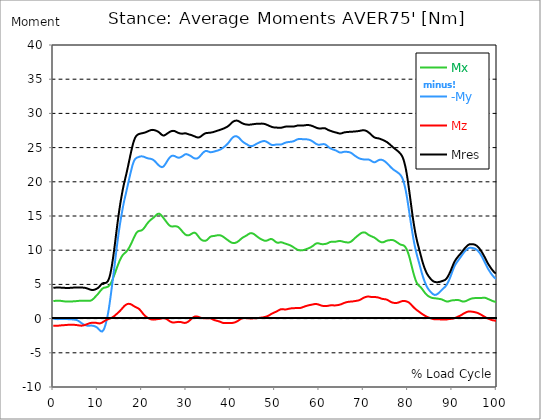
| Category |  Mx |  -My |  Mz |  Mres |
|---|---|---|---|---|
| 0.0 | 2.563 | -0.024 | -1.043 | 4.505 |
| 0.167348456675344 | 2.571 | -0.032 | -1.043 | 4.513 |
| 0.334696913350688 | 2.587 | -0.04 | -1.043 | 4.521 |
| 0.5020453700260321 | 2.602 | -0.056 | -1.051 | 4.528 |
| 0.669393826701376 | 2.61 | -0.064 | -1.051 | 4.536 |
| 0.83674228337672 | 2.618 | -0.08 | -1.051 | 4.544 |
| 1.0040907400520642 | 2.626 | -0.08 | -1.043 | 4.544 |
| 1.1621420602454444 | 2.626 | -0.08 | -1.035 | 4.544 |
| 1.3294905169207885 | 2.618 | -0.072 | -1.019 | 4.544 |
| 1.4968389735961325 | 2.61 | -0.072 | -1.011 | 4.536 |
| 1.6641874302714765 | 2.595 | -0.064 | -0.995 | 4.528 |
| 1.8315358869468206 | 2.579 | -0.064 | -0.987 | 4.528 |
| 1.9988843436221646 | 2.563 | -0.064 | -0.979 | 4.521 |
| 2.1662328002975086 | 2.547 | -0.064 | -0.971 | 4.513 |
| 2.333581256972853 | 2.531 | -0.064 | -0.963 | 4.505 |
| 2.5009297136481967 | 2.515 | -0.064 | -0.955 | 4.497 |
| 2.6682781703235405 | 2.507 | -0.064 | -0.947 | 4.489 |
| 2.8356266269988843 | 2.491 | -0.072 | -0.939 | 4.481 |
| 3.002975083674229 | 2.491 | -0.072 | -0.931 | 4.481 |
| 3.1703235403495724 | 2.483 | -0.072 | -0.915 | 4.473 |
| 3.337671997024917 | 2.483 | -0.08 | -0.907 | 4.481 |
| 3.4957233172182973 | 2.475 | -0.08 | -0.899 | 4.481 |
| 3.663071773893641 | 2.483 | -0.088 | -0.899 | 4.489 |
| 3.8304202305689854 | 2.483 | -0.096 | -0.899 | 4.497 |
| 3.997768687244329 | 2.491 | -0.103 | -0.899 | 4.505 |
| 4.165117143919673 | 2.507 | -0.111 | -0.899 | 4.513 |
| 4.332465600595017 | 2.515 | -0.119 | -0.899 | 4.521 |
| 4.499814057270361 | 2.523 | -0.127 | -0.907 | 4.528 |
| 4.667162513945706 | 2.531 | -0.143 | -0.907 | 4.536 |
| 4.834510970621049 | 2.539 | -0.151 | -0.915 | 4.536 |
| 5.001859427296393 | 2.547 | -0.175 | -0.931 | 4.536 |
| 5.169207883971737 | 2.555 | -0.199 | -0.939 | 4.536 |
| 5.336556340647081 | 2.563 | -0.231 | -0.955 | 4.528 |
| 5.503904797322425 | 2.571 | -0.279 | -0.971 | 4.536 |
| 5.671253253997769 | 2.587 | -0.342 | -0.987 | 4.536 |
| 5.82930457419115 | 2.595 | -0.414 | -1.003 | 4.536 |
| 5.996653030866494 | 2.61 | -0.493 | -1.019 | 4.536 |
| 6.164001487541838 | 2.618 | -0.573 | -1.035 | 4.536 |
| 6.331349944217181 | 2.618 | -0.653 | -1.035 | 4.536 |
| 6.498698400892526 | 2.618 | -0.724 | -1.027 | 4.536 |
| 6.66604685756787 | 2.618 | -0.796 | -1.011 | 4.528 |
| 6.833395314243213 | 2.618 | -0.852 | -0.987 | 4.521 |
| 7.000743770918558 | 2.61 | -0.907 | -0.955 | 4.513 |
| 7.168092227593902 | 2.602 | -0.947 | -0.915 | 4.489 |
| 7.335440684269246 | 2.602 | -0.979 | -0.883 | 4.465 |
| 7.50278914094459 | 2.595 | -1.011 | -0.844 | 4.433 |
| 7.6701375976199335 | 2.595 | -1.035 | -0.796 | 4.401 |
| 7.837486054295278 | 2.595 | -1.043 | -0.756 | 4.361 |
| 7.995537374488658 | 2.595 | -1.043 | -0.716 | 4.322 |
| 8.162885831164003 | 2.595 | -1.035 | -0.676 | 4.274 |
| 8.330234287839346 | 2.618 | -1.027 | -0.645 | 4.234 |
| 8.49758274451469 | 2.65 | -1.027 | -0.629 | 4.21 |
| 8.664931201190035 | 2.706 | -1.027 | -0.613 | 4.186 |
| 8.832279657865378 | 2.786 | -1.043 | -0.605 | 4.178 |
| 8.999628114540721 | 2.873 | -1.059 | -0.597 | 4.186 |
| 9.166976571216066 | 2.985 | -1.09 | -0.597 | 4.202 |
| 9.334325027891412 | 3.096 | -1.122 | -0.597 | 4.242 |
| 9.501673484566755 | 3.207 | -1.162 | -0.605 | 4.282 |
| 9.669021941242098 | 3.327 | -1.218 | -0.621 | 4.33 |
| 9.836370397917442 | 3.438 | -1.289 | -0.645 | 4.385 |
| 10.003718854592787 | 3.558 | -1.385 | -0.669 | 4.449 |
| 10.17106731126813 | 3.685 | -1.496 | -0.692 | 4.536 |
| 10.329118631461512 | 3.82 | -1.624 | -0.708 | 4.648 |
| 10.496467088136853 | 3.955 | -1.743 | -0.7 | 4.767 |
| 10.663815544812199 | 4.091 | -1.831 | -0.676 | 4.895 |
| 10.831164001487544 | 4.226 | -1.886 | -0.629 | 5.014 |
| 10.998512458162887 | 4.345 | -1.886 | -0.573 | 5.117 |
| 11.16586091483823 | 4.441 | -1.815 | -0.501 | 5.189 |
| 11.333209371513574 | 4.497 | -1.655 | -0.438 | 5.213 |
| 11.50055782818892 | 4.528 | -1.401 | -0.366 | 5.205 |
| 11.667906284864264 | 4.544 | -1.09 | -0.302 | 5.197 |
| 11.835254741539607 | 4.56 | -0.716 | -0.247 | 5.213 |
| 12.00260319821495 | 4.584 | -0.279 | -0.183 | 5.269 |
| 12.169951654890292 | 4.624 | 0.207 | -0.135 | 5.372 |
| 12.337300111565641 | 4.68 | 0.756 | -0.088 | 5.523 |
| 12.504648568240984 | 4.767 | 1.385 | -0.048 | 5.762 |
| 12.662699888434362 | 4.871 | 2.093 | 0 | 6.08 |
| 12.830048345109708 | 5.014 | 2.865 | 0.04 | 6.494 |
| 12.997396801785053 | 5.197 | 3.669 | 0.08 | 7.004 |
| 13.164745258460396 | 5.42 | 4.497 | 0.127 | 7.609 |
| 13.33209371513574 | 5.683 | 5.316 | 0.183 | 8.293 |
| 13.499442171811083 | 5.953 | 6.152 | 0.247 | 9.025 |
| 13.666790628486426 | 6.24 | 7.012 | 0.326 | 9.813 |
| 13.834139085161771 | 6.526 | 7.895 | 0.422 | 10.649 |
| 14.001487541837117 | 6.829 | 8.802 | 0.517 | 11.516 |
| 14.16883599851246 | 7.131 | 9.702 | 0.613 | 12.4 |
| 14.336184455187803 | 7.433 | 10.577 | 0.708 | 13.267 |
| 14.503532911863147 | 7.72 | 11.421 | 0.804 | 14.103 |
| 14.670881368538492 | 8.006 | 12.225 | 0.899 | 14.907 |
| 14.828932688731873 | 8.277 | 12.981 | 1.003 | 15.671 |
| 14.996281145407215 | 8.524 | 13.697 | 1.106 | 16.395 |
| 15.163629602082558 | 8.755 | 14.373 | 1.218 | 17.071 |
| 15.330978058757903 | 8.961 | 15.002 | 1.337 | 17.7 |
| 15.498326515433247 | 9.145 | 15.615 | 1.464 | 18.305 |
| 15.665674972108594 | 9.296 | 16.22 | 1.592 | 18.878 |
| 15.833023428783937 | 9.423 | 16.777 | 1.711 | 19.419 |
| 16.00037188545928 | 9.519 | 17.286 | 1.831 | 19.897 |
| 16.167720342134626 | 9.614 | 17.756 | 1.926 | 20.342 |
| 16.335068798809967 | 9.71 | 18.217 | 2.014 | 20.796 |
| 16.502417255485312 | 9.813 | 18.687 | 2.077 | 21.258 |
| 16.669765712160658 | 9.948 | 19.157 | 2.125 | 21.735 |
| 16.837114168836 | 10.1 | 19.642 | 2.157 | 22.237 |
| 17.004462625511344 | 10.267 | 20.128 | 2.165 | 22.746 |
| 17.16251394570472 | 10.458 | 20.613 | 2.157 | 23.255 |
| 17.32986240238007 | 10.665 | 21.083 | 2.133 | 23.765 |
| 17.497210859055414 | 10.88 | 21.536 | 2.093 | 24.266 |
| 17.664559315730756 | 11.11 | 21.974 | 2.037 | 24.752 |
| 17.8319077724061 | 11.349 | 22.372 | 1.966 | 25.205 |
| 17.999256229081443 | 11.588 | 22.714 | 1.894 | 25.619 |
| 18.166604685756788 | 11.827 | 22.993 | 1.823 | 25.977 |
| 18.333953142432133 | 12.057 | 23.216 | 1.759 | 26.272 |
| 18.501301599107478 | 12.272 | 23.367 | 1.703 | 26.502 |
| 18.668650055782823 | 12.455 | 23.462 | 1.655 | 26.67 |
| 18.835998512458165 | 12.607 | 23.526 | 1.608 | 26.797 |
| 19.00334696913351 | 12.718 | 23.574 | 1.552 | 26.884 |
| 19.170695425808855 | 12.79 | 23.605 | 1.496 | 26.948 |
| 19.338043882484197 | 12.821 | 23.645 | 1.417 | 26.988 |
| 19.496095202677576 | 12.837 | 23.685 | 1.305 | 27.028 |
| 19.66344365935292 | 12.853 | 23.709 | 1.186 | 27.052 |
| 19.830792116028263 | 12.877 | 23.725 | 1.043 | 27.075 |
| 19.998140572703612 | 12.941 | 23.725 | 0.907 | 27.099 |
| 20.165489029378953 | 13.02 | 23.709 | 0.764 | 27.123 |
| 20.3328374860543 | 13.132 | 23.677 | 0.637 | 27.147 |
| 20.500185942729644 | 13.267 | 23.637 | 0.517 | 27.171 |
| 20.667534399404985 | 13.418 | 23.59 | 0.406 | 27.203 |
| 20.83488285608033 | 13.578 | 23.542 | 0.31 | 27.251 |
| 21.002231312755672 | 13.737 | 23.494 | 0.231 | 27.29 |
| 21.16957976943102 | 13.888 | 23.462 | 0.159 | 27.338 |
| 21.336928226106362 | 14.023 | 23.43 | 0.088 | 27.386 |
| 21.504276682781704 | 14.151 | 23.407 | 0.032 | 27.434 |
| 21.67162513945705 | 14.262 | 23.391 | -0.016 | 27.481 |
| 21.82967645965043 | 14.365 | 23.375 | -0.064 | 27.521 |
| 21.997024916325774 | 14.461 | 23.351 | -0.096 | 27.553 |
| 22.16437337300112 | 14.548 | 23.319 | -0.127 | 27.577 |
| 22.33172182967646 | 14.636 | 23.279 | -0.143 | 27.593 |
| 22.499070286351806 | 14.716 | 23.223 | -0.151 | 27.585 |
| 22.666418743027148 | 14.803 | 23.144 | -0.151 | 27.569 |
| 22.833767199702496 | 14.899 | 23.048 | -0.143 | 27.545 |
| 23.00111565637784 | 15.002 | 22.945 | -0.127 | 27.513 |
| 23.168464113053183 | 15.114 | 22.826 | -0.111 | 27.473 |
| 23.335812569728528 | 15.217 | 22.706 | -0.088 | 27.434 |
| 23.50316102640387 | 15.305 | 22.579 | -0.072 | 27.378 |
| 23.670509483079215 | 15.344 | 22.467 | -0.064 | 27.314 |
| 23.83785793975456 | 15.344 | 22.372 | -0.048 | 27.235 |
| 23.995909259947936 | 15.305 | 22.284 | -0.04 | 27.147 |
| 24.163257716623285 | 15.225 | 22.221 | -0.016 | 27.052 |
| 24.330606173298627 | 15.106 | 22.165 | 0 | 26.94 |
| 24.49795462997397 | 14.986 | 22.141 | 0.024 | 26.853 |
| 24.665303086649313 | 14.851 | 22.165 | 0.048 | 26.789 |
| 24.83265154332466 | 14.716 | 22.229 | 0.064 | 26.765 |
| 25.0 | 14.572 | 22.34 | 0.056 | 26.781 |
| 25.167348456675345 | 14.429 | 22.491 | 0.04 | 26.829 |
| 25.334696913350694 | 14.286 | 22.658 | 0.008 | 26.892 |
| 25.502045370026035 | 14.143 | 22.834 | -0.048 | 26.972 |
| 25.669393826701377 | 13.999 | 23.017 | -0.111 | 27.044 |
| 25.836742283376722 | 13.864 | 23.192 | -0.191 | 27.123 |
| 26.004090740052067 | 13.737 | 23.351 | -0.271 | 27.195 |
| 26.17143919672741 | 13.625 | 23.494 | -0.35 | 27.259 |
| 26.329490516920792 | 13.546 | 23.613 | -0.422 | 27.322 |
| 26.49683897359613 | 13.498 | 23.717 | -0.485 | 27.378 |
| 26.66418743027148 | 13.474 | 23.781 | -0.525 | 27.418 |
| 26.831535886946828 | 13.466 | 23.812 | -0.557 | 27.442 |
| 26.998884343622166 | 13.474 | 23.82 | -0.573 | 27.45 |
| 27.166232800297514 | 13.49 | 23.797 | -0.573 | 27.442 |
| 27.333581256972852 | 13.506 | 23.765 | -0.557 | 27.418 |
| 27.5009297136482 | 13.506 | 23.709 | -0.541 | 27.37 |
| 27.668278170323543 | 13.498 | 23.653 | -0.525 | 27.322 |
| 27.835626626998888 | 13.474 | 23.605 | -0.509 | 27.259 |
| 28.002975083674233 | 13.442 | 23.558 | -0.493 | 27.203 |
| 28.170323540349575 | 13.387 | 23.526 | -0.485 | 27.155 |
| 28.33767199702492 | 13.299 | 23.518 | -0.478 | 27.115 |
| 28.50502045370026 | 13.196 | 23.542 | -0.485 | 27.083 |
| 28.663071773893645 | 13.076 | 23.582 | -0.493 | 27.06 |
| 28.830420230568986 | 12.949 | 23.629 | -0.517 | 27.044 |
| 28.99776868724433 | 12.814 | 23.693 | -0.541 | 27.036 |
| 29.165117143919673 | 12.686 | 23.765 | -0.573 | 27.036 |
| 29.33246560059502 | 12.559 | 23.836 | -0.605 | 27.052 |
| 29.499814057270367 | 12.447 | 23.924 | -0.629 | 27.075 |
| 29.66716251394571 | 12.344 | 24.003 | -0.637 | 27.091 |
| 29.834510970621054 | 12.264 | 24.043 | -0.621 | 27.091 |
| 30.00185942729639 | 12.201 | 24.051 | -0.589 | 27.068 |
| 30.169207883971744 | 12.169 | 24.027 | -0.549 | 27.028 |
| 30.33655634064708 | 12.153 | 23.98 | -0.485 | 26.98 |
| 30.50390479732243 | 12.169 | 23.932 | -0.414 | 26.94 |
| 30.671253253997772 | 12.209 | 23.876 | -0.318 | 26.908 |
| 30.829304574191156 | 12.264 | 23.828 | -0.223 | 26.884 |
| 30.996653030866494 | 12.328 | 23.765 | -0.119 | 26.861 |
| 31.164001487541842 | 12.392 | 23.693 | -0.016 | 26.829 |
| 31.331349944217187 | 12.455 | 23.613 | 0.08 | 26.781 |
| 31.498698400892525 | 12.519 | 23.542 | 0.159 | 26.741 |
| 31.666046857567874 | 12.559 | 23.47 | 0.231 | 26.693 |
| 31.833395314243212 | 12.567 | 23.422 | 0.287 | 26.654 |
| 32.00074377091856 | 12.535 | 23.391 | 0.31 | 26.606 |
| 32.1680922275939 | 12.455 | 23.375 | 0.326 | 26.558 |
| 32.33544068426925 | 12.336 | 23.391 | 0.318 | 26.51 |
| 32.50278914094459 | 12.201 | 23.43 | 0.302 | 26.487 |
| 32.670137597619934 | 12.049 | 23.494 | 0.263 | 26.479 |
| 32.83748605429528 | 11.906 | 23.582 | 0.223 | 26.487 |
| 33.004834510970625 | 11.771 | 23.685 | 0.175 | 26.518 |
| 33.162885831164004 | 11.652 | 23.812 | 0.135 | 26.582 |
| 33.33023428783935 | 11.556 | 23.94 | 0.103 | 26.662 |
| 33.497582744514695 | 11.484 | 24.067 | 0.088 | 26.749 |
| 33.664931201190036 | 11.429 | 24.179 | 0.072 | 26.837 |
| 33.83227965786538 | 11.397 | 24.29 | 0.056 | 26.916 |
| 33.99962811454073 | 11.365 | 24.385 | 0.048 | 26.988 |
| 34.16697657121607 | 11.365 | 24.457 | 0.048 | 27.052 |
| 34.33432502789141 | 11.381 | 24.505 | 0.04 | 27.099 |
| 34.50167348456676 | 11.421 | 24.513 | 0.04 | 27.123 |
| 34.6690219412421 | 11.492 | 24.497 | 0.048 | 27.139 |
| 34.83637039791744 | 11.596 | 24.457 | 0.064 | 27.139 |
| 35.00371885459279 | 11.707 | 24.417 | 0.072 | 27.155 |
| 35.17106731126814 | 11.827 | 24.37 | 0.072 | 27.163 |
| 35.338415767943474 | 11.93 | 24.338 | 0.048 | 27.171 |
| 35.49646708813686 | 11.994 | 24.33 | 0.016 | 27.195 |
| 35.6638155448122 | 12.034 | 24.338 | -0.024 | 27.219 |
| 35.831164001487544 | 12.057 | 24.354 | -0.072 | 27.235 |
| 35.998512458162885 | 12.065 | 24.377 | -0.127 | 27.259 |
| 36.165860914838234 | 12.073 | 24.401 | -0.175 | 27.29 |
| 36.333209371513576 | 12.089 | 24.433 | -0.223 | 27.322 |
| 36.50055782818892 | 12.113 | 24.473 | -0.255 | 27.362 |
| 36.667906284864266 | 12.137 | 24.505 | -0.287 | 27.402 |
| 36.83525474153961 | 12.161 | 24.529 | -0.31 | 27.434 |
| 37.002603198214956 | 12.177 | 24.561 | -0.334 | 27.465 |
| 37.1699516548903 | 12.193 | 24.6 | -0.366 | 27.505 |
| 37.337300111565646 | 12.193 | 24.632 | -0.398 | 27.537 |
| 37.50464856824098 | 12.185 | 24.68 | -0.43 | 27.569 |
| 37.66269988843437 | 12.169 | 24.728 | -0.47 | 27.609 |
| 37.83004834510971 | 12.137 | 24.783 | -0.517 | 27.649 |
| 37.99739680178505 | 12.089 | 24.847 | -0.573 | 27.688 |
| 38.16474525846039 | 12.026 | 24.927 | -0.613 | 27.728 |
| 38.33209371513574 | 11.962 | 24.998 | -0.637 | 27.768 |
| 38.49944217181109 | 11.882 | 25.086 | -0.661 | 27.816 |
| 38.666790628486424 | 11.803 | 25.173 | -0.661 | 27.863 |
| 38.83413908516178 | 11.723 | 25.269 | -0.661 | 27.911 |
| 39.001487541837115 | 11.636 | 25.364 | -0.653 | 27.967 |
| 39.16883599851246 | 11.564 | 25.46 | -0.645 | 28.023 |
| 39.336184455187805 | 11.484 | 25.571 | -0.645 | 28.094 |
| 39.503532911863154 | 11.405 | 25.691 | -0.645 | 28.174 |
| 39.670881368538495 | 11.317 | 25.834 | -0.645 | 28.269 |
| 39.83822982521384 | 11.238 | 25.985 | -0.653 | 28.381 |
| 39.996281145407224 | 11.174 | 26.136 | -0.645 | 28.484 |
| 40.163629602082565 | 11.118 | 26.28 | -0.645 | 28.596 |
| 40.33097805875791 | 11.079 | 26.399 | -0.637 | 28.691 |
| 40.498326515433256 | 11.055 | 26.502 | -0.621 | 28.771 |
| 40.6656749721086 | 11.047 | 26.574 | -0.597 | 28.842 |
| 40.83302342878393 | 11.047 | 26.638 | -0.573 | 28.89 |
| 41.00037188545929 | 11.071 | 26.67 | -0.541 | 28.93 |
| 41.16772034213463 | 11.102 | 26.686 | -0.493 | 28.954 |
| 41.33506879880997 | 11.15 | 26.662 | -0.446 | 28.954 |
| 41.50241725548531 | 11.214 | 26.622 | -0.382 | 28.938 |
| 41.66976571216066 | 11.277 | 26.55 | -0.318 | 28.906 |
| 41.837114168836 | 11.365 | 26.463 | -0.247 | 28.858 |
| 42.004462625511344 | 11.453 | 26.351 | -0.167 | 28.795 |
| 42.17181108218669 | 11.556 | 26.232 | -0.096 | 28.731 |
| 42.32986240238007 | 11.652 | 26.112 | -0.024 | 28.659 |
| 42.497210859055414 | 11.747 | 26.001 | 0.032 | 28.596 |
| 42.66455931573076 | 11.819 | 25.898 | 0.064 | 28.54 |
| 42.831907772406105 | 11.882 | 25.81 | 0.08 | 28.492 |
| 42.999256229081446 | 11.946 | 25.73 | 0.08 | 28.452 |
| 43.16660468575679 | 12.01 | 25.659 | 0.08 | 28.421 |
| 43.33395314243214 | 12.065 | 25.595 | 0.072 | 28.397 |
| 43.50130159910748 | 12.121 | 25.539 | 0.064 | 28.381 |
| 43.66865005578282 | 12.185 | 25.476 | 0.056 | 28.365 |
| 43.83599851245817 | 12.264 | 25.404 | 0.048 | 28.357 |
| 44.00334696913351 | 12.344 | 25.333 | 0.04 | 28.349 |
| 44.17069542580886 | 12.416 | 25.269 | 0.04 | 28.349 |
| 44.3380438824842 | 12.463 | 25.237 | 0.032 | 28.357 |
| 44.49609520267758 | 12.487 | 25.213 | 0.032 | 28.365 |
| 44.66344365935292 | 12.495 | 25.213 | 0.032 | 28.381 |
| 44.83079211602827 | 12.479 | 25.229 | 0.032 | 28.397 |
| 44.99814057270361 | 12.439 | 25.253 | 0.032 | 28.413 |
| 45.16548902937895 | 12.384 | 25.301 | 0.04 | 28.428 |
| 45.332837486054295 | 12.32 | 25.356 | 0.048 | 28.444 |
| 45.500185942729644 | 12.24 | 25.412 | 0.056 | 28.46 |
| 45.66753439940499 | 12.153 | 25.484 | 0.056 | 28.468 |
| 45.83488285608033 | 12.065 | 25.547 | 0.064 | 28.484 |
| 46.00223131275568 | 11.978 | 25.611 | 0.072 | 28.484 |
| 46.16957976943102 | 11.898 | 25.667 | 0.08 | 28.492 |
| 46.336928226106366 | 11.819 | 25.715 | 0.096 | 28.492 |
| 46.50427668278171 | 11.747 | 25.762 | 0.111 | 28.492 |
| 46.671625139457056 | 11.683 | 25.81 | 0.119 | 28.492 |
| 46.829676459650436 | 11.62 | 25.85 | 0.135 | 28.5 |
| 46.99702491632577 | 11.564 | 25.89 | 0.151 | 28.508 |
| 47.16437337300112 | 11.516 | 25.921 | 0.167 | 28.508 |
| 47.33172182967646 | 11.468 | 25.945 | 0.183 | 28.5 |
| 47.49907028635181 | 11.421 | 25.953 | 0.207 | 28.484 |
| 47.66641874302716 | 11.381 | 25.953 | 0.231 | 28.452 |
| 47.83376719970249 | 11.365 | 25.929 | 0.255 | 28.421 |
| 48.001115656377834 | 11.373 | 25.89 | 0.287 | 28.381 |
| 48.16846411305319 | 11.405 | 25.826 | 0.318 | 28.333 |
| 48.33581256972853 | 11.453 | 25.762 | 0.366 | 28.285 |
| 48.50316102640387 | 11.5 | 25.691 | 0.422 | 28.237 |
| 48.67050948307921 | 11.548 | 25.619 | 0.478 | 28.19 |
| 48.837857939754564 | 11.604 | 25.539 | 0.549 | 28.142 |
| 49.005206396429905 | 11.636 | 25.468 | 0.613 | 28.094 |
| 49.163257716623285 | 11.644 | 25.412 | 0.684 | 28.046 |
| 49.33060617329863 | 11.612 | 25.38 | 0.74 | 28.015 |
| 49.49795462997397 | 11.556 | 25.364 | 0.796 | 27.983 |
| 49.66530308664932 | 11.484 | 25.372 | 0.844 | 27.959 |
| 49.832651543324666 | 11.389 | 25.388 | 0.891 | 27.951 |
| 50.0 | 11.293 | 25.412 | 0.939 | 27.943 |
| 50.16734845667534 | 11.206 | 25.436 | 0.987 | 27.935 |
| 50.33469691335069 | 11.142 | 25.46 | 1.035 | 27.927 |
| 50.50204537002604 | 11.094 | 25.468 | 1.09 | 27.919 |
| 50.66939382670139 | 11.086 | 25.468 | 1.154 | 27.911 |
| 50.836742283376715 | 11.094 | 25.46 | 1.218 | 27.903 |
| 51.00409074005207 | 11.118 | 25.452 | 1.281 | 27.895 |
| 51.17143919672741 | 11.15 | 25.444 | 1.329 | 27.895 |
| 51.32949051692079 | 11.166 | 25.452 | 1.369 | 27.903 |
| 51.496838973596134 | 11.15 | 25.476 | 1.385 | 27.919 |
| 51.66418743027148 | 11.118 | 25.516 | 1.385 | 27.943 |
| 51.831535886946824 | 11.079 | 25.571 | 1.369 | 27.975 |
| 51.99888434362217 | 11.039 | 25.627 | 1.353 | 28.007 |
| 52.16623280029752 | 11.007 | 25.675 | 1.337 | 28.038 |
| 52.33358125697285 | 10.967 | 25.715 | 1.329 | 28.062 |
| 52.5009297136482 | 10.927 | 25.746 | 1.337 | 28.078 |
| 52.668278170323546 | 10.887 | 25.778 | 1.361 | 28.086 |
| 52.835626626998895 | 10.848 | 25.794 | 1.393 | 28.094 |
| 53.00297508367424 | 10.816 | 25.81 | 1.417 | 28.094 |
| 53.17032354034958 | 10.776 | 25.818 | 1.441 | 28.086 |
| 53.33767199702492 | 10.736 | 25.834 | 1.464 | 28.086 |
| 53.50502045370027 | 10.689 | 25.842 | 1.48 | 28.078 |
| 53.663071773893655 | 10.633 | 25.858 | 1.496 | 28.07 |
| 53.83042023056899 | 10.577 | 25.874 | 1.504 | 28.07 |
| 53.99776868724433 | 10.505 | 25.898 | 1.512 | 28.07 |
| 54.16511714391967 | 10.434 | 25.929 | 1.52 | 28.078 |
| 54.33246560059503 | 10.362 | 25.969 | 1.528 | 28.094 |
| 54.49981405727037 | 10.291 | 26.025 | 1.536 | 28.118 |
| 54.667162513945705 | 10.219 | 26.081 | 1.536 | 28.15 |
| 54.834510970621054 | 10.155 | 26.136 | 1.536 | 28.182 |
| 55.0018594272964 | 10.092 | 26.192 | 1.536 | 28.214 |
| 55.169207883971744 | 10.044 | 26.232 | 1.536 | 28.237 |
| 55.336556340647086 | 10.012 | 26.256 | 1.536 | 28.245 |
| 55.50390479732243 | 9.988 | 26.264 | 1.544 | 28.253 |
| 55.671253253997776 | 9.972 | 26.264 | 1.552 | 28.245 |
| 55.83860171067312 | 9.972 | 26.256 | 1.576 | 28.245 |
| 55.9966530308665 | 9.98 | 26.248 | 1.608 | 28.237 |
| 56.16400148754184 | 9.988 | 26.232 | 1.647 | 28.23 |
| 56.33134994421718 | 10.004 | 26.224 | 1.687 | 28.23 |
| 56.498698400892536 | 10.028 | 26.224 | 1.727 | 28.237 |
| 56.66604685756788 | 10.06 | 26.232 | 1.767 | 28.253 |
| 56.83339531424321 | 10.1 | 26.232 | 1.807 | 28.277 |
| 57.00074377091856 | 10.147 | 26.224 | 1.838 | 28.285 |
| 57.16809222759391 | 10.187 | 26.208 | 1.87 | 28.293 |
| 57.33544068426925 | 10.227 | 26.192 | 1.902 | 28.293 |
| 57.5027891409446 | 10.259 | 26.176 | 1.934 | 28.285 |
| 57.670137597619934 | 10.307 | 26.152 | 1.958 | 28.285 |
| 57.83748605429528 | 10.354 | 26.12 | 1.982 | 28.269 |
| 58.004834510970625 | 10.41 | 26.081 | 1.998 | 28.245 |
| 58.16288583116401 | 10.474 | 26.033 | 2.022 | 28.214 |
| 58.330234287839346 | 10.537 | 25.969 | 2.045 | 28.182 |
| 58.497582744514695 | 10.609 | 25.906 | 2.061 | 28.142 |
| 58.66493120119004 | 10.689 | 25.826 | 2.085 | 28.094 |
| 58.832279657865385 | 10.784 | 25.746 | 2.109 | 28.046 |
| 58.999628114540734 | 10.872 | 25.659 | 2.133 | 27.999 |
| 59.16697657121607 | 10.943 | 25.587 | 2.141 | 27.951 |
| 59.33432502789142 | 10.991 | 25.524 | 2.133 | 27.903 |
| 59.50167348456676 | 11.015 | 25.476 | 2.109 | 27.863 |
| 59.66902194124211 | 11.023 | 25.436 | 2.085 | 27.832 |
| 59.83637039791745 | 11.007 | 25.42 | 2.045 | 27.808 |
| 60.00371885459278 | 10.975 | 25.42 | 2.014 | 27.792 |
| 60.17106731126813 | 10.935 | 25.428 | 1.974 | 27.784 |
| 60.33841576794349 | 10.903 | 25.452 | 1.934 | 27.792 |
| 60.49646708813685 | 10.887 | 25.468 | 1.902 | 27.808 |
| 60.6638155448122 | 10.88 | 25.492 | 1.87 | 27.824 |
| 60.831164001487544 | 10.887 | 25.508 | 1.846 | 27.84 |
| 60.99851245816289 | 10.887 | 25.516 | 1.838 | 27.847 |
| 61.16586091483824 | 10.895 | 25.5 | 1.831 | 27.84 |
| 61.333209371513576 | 10.911 | 25.468 | 1.831 | 27.816 |
| 61.50055782818892 | 10.935 | 25.404 | 1.831 | 27.768 |
| 61.667906284864266 | 10.967 | 25.317 | 1.838 | 27.704 |
| 61.835254741539615 | 11.007 | 25.213 | 1.854 | 27.633 |
| 62.002603198214956 | 11.055 | 25.118 | 1.878 | 27.577 |
| 62.16995165489029 | 11.11 | 25.03 | 1.894 | 27.529 |
| 62.33730011156564 | 11.174 | 24.951 | 1.918 | 27.489 |
| 62.504648568240995 | 11.214 | 24.887 | 1.934 | 27.458 |
| 62.67199702491633 | 11.23 | 24.839 | 1.95 | 27.418 |
| 62.83004834510971 | 11.23 | 24.791 | 1.958 | 27.386 |
| 62.99739680178505 | 11.222 | 24.744 | 1.95 | 27.338 |
| 63.1647452584604 | 11.222 | 24.704 | 1.934 | 27.298 |
| 63.33209371513575 | 11.222 | 24.672 | 1.926 | 27.274 |
| 63.4994421718111 | 11.23 | 24.64 | 1.926 | 27.251 |
| 63.666790628486424 | 11.246 | 24.6 | 1.934 | 27.219 |
| 63.83413908516177 | 11.262 | 24.553 | 1.942 | 27.195 |
| 64.00148754183712 | 11.285 | 24.489 | 1.958 | 27.163 |
| 64.16883599851248 | 11.317 | 24.425 | 1.982 | 27.123 |
| 64.3361844551878 | 11.333 | 24.362 | 1.998 | 27.091 |
| 64.50353291186315 | 11.349 | 24.306 | 2.022 | 27.068 |
| 64.6708813685385 | 11.357 | 24.274 | 2.045 | 27.052 |
| 64.83822982521384 | 11.341 | 24.258 | 2.077 | 27.052 |
| 65.00557828188919 | 11.309 | 24.274 | 2.117 | 27.083 |
| 65.16362960208257 | 11.285 | 24.314 | 2.165 | 27.123 |
| 65.3309780587579 | 11.254 | 24.354 | 2.22 | 27.163 |
| 65.49832651543326 | 11.222 | 24.377 | 2.26 | 27.203 |
| 65.6656749721086 | 11.198 | 24.393 | 2.3 | 27.227 |
| 65.83302342878395 | 11.174 | 24.393 | 2.34 | 27.243 |
| 66.00037188545929 | 11.158 | 24.393 | 2.372 | 27.259 |
| 66.16772034213463 | 11.142 | 24.385 | 2.404 | 27.266 |
| 66.33506879880998 | 11.134 | 24.37 | 2.427 | 27.274 |
| 66.50241725548531 | 11.126 | 24.354 | 2.451 | 27.29 |
| 66.66976571216065 | 11.134 | 24.338 | 2.467 | 27.298 |
| 66.83711416883601 | 11.158 | 24.314 | 2.475 | 27.306 |
| 67.00446262551135 | 11.198 | 24.282 | 2.483 | 27.314 |
| 67.1718110821867 | 11.262 | 24.226 | 2.491 | 27.322 |
| 67.32986240238007 | 11.341 | 24.163 | 2.499 | 27.322 |
| 67.49721085905541 | 11.437 | 24.075 | 2.507 | 27.33 |
| 67.66455931573076 | 11.548 | 23.988 | 2.523 | 27.338 |
| 67.83190777240611 | 11.659 | 23.9 | 2.539 | 27.354 |
| 67.99925622908145 | 11.755 | 23.82 | 2.563 | 27.362 |
| 68.16660468575678 | 11.851 | 23.749 | 2.579 | 27.37 |
| 68.33395314243214 | 11.938 | 23.677 | 2.595 | 27.378 |
| 68.50130159910749 | 12.026 | 23.605 | 2.61 | 27.394 |
| 68.66865005578282 | 12.121 | 23.542 | 2.634 | 27.402 |
| 68.83599851245816 | 12.209 | 23.486 | 2.658 | 27.418 |
| 69.00334696913352 | 12.296 | 23.43 | 2.69 | 27.434 |
| 69.17069542580886 | 12.384 | 23.383 | 2.738 | 27.45 |
| 69.3380438824842 | 12.455 | 23.351 | 2.794 | 27.481 |
| 69.50539233915956 | 12.519 | 23.327 | 2.857 | 27.505 |
| 69.66344365935292 | 12.559 | 23.303 | 2.921 | 27.521 |
| 69.83079211602826 | 12.591 | 23.287 | 2.985 | 27.537 |
| 69.99814057270362 | 12.607 | 23.271 | 3.04 | 27.537 |
| 70.16548902937896 | 12.607 | 23.255 | 3.088 | 27.529 |
| 70.33283748605429 | 12.583 | 23.247 | 3.136 | 27.505 |
| 70.50018594272964 | 12.535 | 23.247 | 3.168 | 27.473 |
| 70.667534399405 | 12.455 | 23.255 | 3.199 | 27.418 |
| 70.83488285608033 | 12.36 | 23.263 | 3.223 | 27.346 |
| 71.00223131275568 | 12.28 | 23.271 | 3.231 | 27.274 |
| 71.16957976943102 | 12.209 | 23.255 | 3.223 | 27.203 |
| 71.33692822610637 | 12.161 | 23.208 | 3.207 | 27.107 |
| 71.50427668278171 | 12.105 | 23.152 | 3.183 | 27.012 |
| 71.67162513945706 | 12.057 | 23.08 | 3.16 | 26.908 |
| 71.8389735961324 | 12.002 | 23.009 | 3.144 | 26.797 |
| 71.99702491632577 | 11.962 | 22.945 | 3.144 | 26.701 |
| 72.16437337300113 | 11.922 | 22.889 | 3.144 | 26.606 |
| 72.33172182967647 | 11.874 | 22.857 | 3.144 | 26.526 |
| 72.49907028635181 | 11.819 | 22.849 | 3.152 | 26.463 |
| 72.66641874302715 | 11.739 | 22.881 | 3.144 | 26.423 |
| 72.8337671997025 | 11.652 | 22.945 | 3.144 | 26.399 |
| 73.00111565637783 | 11.564 | 23.025 | 3.128 | 26.383 |
| 73.16846411305319 | 11.476 | 23.096 | 3.104 | 26.375 |
| 73.33581256972853 | 11.389 | 23.152 | 3.08 | 26.351 |
| 73.50316102640387 | 11.317 | 23.2 | 3.048 | 26.327 |
| 73.67050948307921 | 11.254 | 23.223 | 3.008 | 26.288 |
| 73.83785793975457 | 11.198 | 23.231 | 2.961 | 26.248 |
| 74.00520639642991 | 11.166 | 23.223 | 2.921 | 26.2 |
| 74.16325771662328 | 11.15 | 23.2 | 2.889 | 26.16 |
| 74.33060617329863 | 11.15 | 23.16 | 2.865 | 26.112 |
| 74.49795462997398 | 11.174 | 23.104 | 2.857 | 26.065 |
| 74.66530308664932 | 11.222 | 23.04 | 2.841 | 26.009 |
| 74.83265154332466 | 11.277 | 22.953 | 2.833 | 25.953 |
| 75.00000000000001 | 11.333 | 22.865 | 2.817 | 25.898 |
| 75.16734845667534 | 11.373 | 22.778 | 2.794 | 25.842 |
| 75.3346969133507 | 11.405 | 22.674 | 2.746 | 25.77 |
| 75.50204537002605 | 11.429 | 22.563 | 2.69 | 25.683 |
| 75.66939382670138 | 11.453 | 22.451 | 2.618 | 25.595 |
| 75.83674228337672 | 11.468 | 22.332 | 2.547 | 25.5 |
| 76.00409074005208 | 11.476 | 22.221 | 2.483 | 25.412 |
| 76.17143919672742 | 11.484 | 22.117 | 2.427 | 25.317 |
| 76.33878765340276 | 11.484 | 22.006 | 2.38 | 25.221 |
| 76.49683897359614 | 11.484 | 21.902 | 2.348 | 25.126 |
| 76.66418743027148 | 11.468 | 21.807 | 2.316 | 25.03 |
| 76.83153588694682 | 11.429 | 21.727 | 2.3 | 24.935 |
| 76.99888434362218 | 11.373 | 21.656 | 2.284 | 24.847 |
| 77.16623280029752 | 11.309 | 21.592 | 2.284 | 24.767 |
| 77.33358125697285 | 11.246 | 21.52 | 2.276 | 24.688 |
| 77.5009297136482 | 11.174 | 21.441 | 2.292 | 24.6 |
| 77.66827817032356 | 11.094 | 21.369 | 2.316 | 24.513 |
| 77.83562662699889 | 11.023 | 21.29 | 2.348 | 24.425 |
| 78.00297508367423 | 10.943 | 21.194 | 2.388 | 24.322 |
| 78.17032354034959 | 10.872 | 21.099 | 2.435 | 24.21 |
| 78.33767199702493 | 10.816 | 20.971 | 2.483 | 24.083 |
| 78.50502045370027 | 10.784 | 20.812 | 2.523 | 23.932 |
| 78.67236891037561 | 10.76 | 20.621 | 2.555 | 23.757 |
| 78.83042023056899 | 10.736 | 20.366 | 2.579 | 23.526 |
| 78.99776868724433 | 10.704 | 20.048 | 2.579 | 23.239 |
| 79.16511714391969 | 10.641 | 19.658 | 2.571 | 22.873 |
| 79.33246560059503 | 10.521 | 19.212 | 2.563 | 22.444 |
| 79.49981405727036 | 10.37 | 18.711 | 2.539 | 21.942 |
| 79.66716251394571 | 10.171 | 18.138 | 2.515 | 21.369 |
| 79.83451097062107 | 9.932 | 17.501 | 2.475 | 20.716 |
| 80.00185942729641 | 9.654 | 16.817 | 2.427 | 20 |
| 80.16920788397174 | 9.328 | 16.092 | 2.372 | 19.236 |
| 80.33655634064709 | 8.961 | 15.368 | 2.292 | 18.432 |
| 80.50390479732243 | 8.556 | 14.644 | 2.197 | 17.629 |
| 80.67125325399778 | 8.134 | 13.928 | 2.085 | 16.817 |
| 80.83860171067312 | 7.688 | 13.227 | 1.966 | 16.005 |
| 80.99665303086651 | 7.25 | 12.535 | 1.838 | 15.209 |
| 81.16400148754184 | 6.821 | 11.89 | 1.727 | 14.461 |
| 81.3313499442172 | 6.431 | 11.293 | 1.616 | 13.761 |
| 81.49869840089255 | 6.065 | 10.744 | 1.512 | 13.116 |
| 81.66604685756786 | 5.738 | 10.235 | 1.417 | 12.519 |
| 81.83339531424322 | 5.444 | 9.765 | 1.321 | 11.97 |
| 82.00074377091858 | 5.213 | 9.328 | 1.242 | 11.476 |
| 82.16809222759392 | 5.03 | 8.93 | 1.162 | 11.031 |
| 82.33544068426926 | 4.887 | 8.548 | 1.082 | 10.609 |
| 82.50278914094459 | 4.783 | 8.158 | 1.003 | 10.203 |
| 82.67013759761994 | 4.704 | 7.76 | 0.923 | 9.789 |
| 82.83748605429528 | 4.616 | 7.354 | 0.844 | 9.375 |
| 83.00483451097062 | 4.497 | 6.956 | 0.764 | 8.961 |
| 83.17218296764597 | 4.353 | 6.574 | 0.692 | 8.556 |
| 83.33023428783935 | 4.202 | 6.208 | 0.621 | 8.182 |
| 83.4975827445147 | 4.051 | 5.881 | 0.549 | 7.831 |
| 83.66493120119004 | 3.9 | 5.571 | 0.485 | 7.513 |
| 83.83227965786537 | 3.764 | 5.293 | 0.422 | 7.226 |
| 83.99962811454073 | 3.629 | 5.03 | 0.358 | 6.964 |
| 84.16697657121607 | 3.51 | 4.791 | 0.294 | 6.725 |
| 84.33432502789142 | 3.414 | 4.584 | 0.247 | 6.518 |
| 84.50167348456677 | 3.327 | 4.401 | 0.199 | 6.343 |
| 84.6690219412421 | 3.255 | 4.242 | 0.159 | 6.176 |
| 84.83637039791745 | 3.191 | 4.099 | 0.119 | 6.033 |
| 85.0037188545928 | 3.136 | 3.979 | 0.08 | 5.897 |
| 85.17106731126813 | 3.088 | 3.868 | 0.048 | 5.77 |
| 85.33841576794349 | 3.048 | 3.764 | 0.008 | 5.659 |
| 85.50576422461883 | 3.016 | 3.661 | -0.032 | 5.555 |
| 85.66381554481221 | 3 | 3.565 | -0.064 | 5.476 |
| 85.83116400148755 | 2.985 | 3.502 | -0.088 | 5.412 |
| 85.99851245816289 | 2.977 | 3.462 | -0.103 | 5.372 |
| 86.16586091483823 | 2.969 | 3.454 | -0.111 | 5.34 |
| 86.33320937151358 | 2.953 | 3.478 | -0.111 | 5.324 |
| 86.50055782818893 | 2.937 | 3.534 | -0.111 | 5.324 |
| 86.66790628486427 | 2.921 | 3.597 | -0.103 | 5.324 |
| 86.83525474153961 | 2.905 | 3.685 | -0.103 | 5.332 |
| 87.00260319821496 | 2.889 | 3.772 | -0.103 | 5.348 |
| 87.16995165489031 | 2.873 | 3.876 | -0.111 | 5.372 |
| 87.33730011156564 | 2.849 | 3.987 | -0.119 | 5.404 |
| 87.504648568241 | 2.825 | 4.099 | -0.127 | 5.436 |
| 87.67199702491634 | 2.794 | 4.218 | -0.127 | 5.476 |
| 87.83004834510972 | 2.754 | 4.322 | -0.135 | 5.515 |
| 87.99739680178506 | 2.698 | 4.425 | -0.143 | 5.547 |
| 88.1647452584604 | 2.642 | 4.521 | -0.143 | 5.587 |
| 88.33209371513574 | 2.587 | 4.616 | -0.143 | 5.643 |
| 88.49944217181108 | 2.547 | 4.735 | -0.143 | 5.722 |
| 88.66679062848644 | 2.515 | 4.879 | -0.135 | 5.826 |
| 88.83413908516178 | 2.491 | 5.062 | -0.111 | 5.969 |
| 89.00148754183712 | 2.491 | 5.269 | -0.088 | 6.152 |
| 89.16883599851246 | 2.523 | 5.492 | -0.072 | 6.351 |
| 89.33618445518782 | 2.555 | 5.73 | -0.056 | 6.566 |
| 89.50353291186315 | 2.595 | 5.993 | -0.048 | 6.797 |
| 89.6708813685385 | 2.626 | 6.271 | -0.04 | 7.043 |
| 89.83822982521386 | 2.65 | 6.566 | -0.032 | 7.314 |
| 90.00557828188919 | 2.666 | 6.86 | -0.016 | 7.585 |
| 90.16362960208257 | 2.674 | 7.147 | 0 | 7.847 |
| 90.3309780587579 | 2.682 | 7.418 | 0.032 | 8.094 |
| 90.49832651543326 | 2.698 | 7.656 | 0.064 | 8.309 |
| 90.66567497210859 | 2.706 | 7.863 | 0.103 | 8.508 |
| 90.83302342878395 | 2.714 | 8.046 | 0.143 | 8.675 |
| 91.00037188545929 | 2.722 | 8.205 | 0.191 | 8.818 |
| 91.16772034213463 | 2.722 | 8.357 | 0.247 | 8.961 |
| 91.33506879880998 | 2.714 | 8.508 | 0.302 | 9.097 |
| 91.50241725548533 | 2.698 | 8.659 | 0.35 | 9.224 |
| 91.66976571216065 | 2.666 | 8.802 | 0.398 | 9.344 |
| 91.83711416883601 | 2.618 | 8.954 | 0.454 | 9.471 |
| 92.00446262551137 | 2.571 | 9.105 | 0.509 | 9.598 |
| 92.1718110821867 | 2.531 | 9.264 | 0.573 | 9.741 |
| 92.33915953886203 | 2.499 | 9.423 | 0.645 | 9.885 |
| 92.49721085905541 | 2.491 | 9.574 | 0.716 | 10.036 |
| 92.66455931573077 | 2.499 | 9.718 | 0.78 | 10.171 |
| 92.83190777240611 | 2.523 | 9.837 | 0.828 | 10.291 |
| 92.99925622908145 | 2.555 | 9.948 | 0.883 | 10.41 |
| 93.1666046857568 | 2.595 | 10.052 | 0.931 | 10.521 |
| 93.33395314243214 | 2.642 | 10.139 | 0.979 | 10.625 |
| 93.50130159910749 | 2.69 | 10.227 | 1.011 | 10.72 |
| 93.66865005578283 | 2.754 | 10.291 | 1.035 | 10.8 |
| 93.83599851245818 | 2.801 | 10.338 | 1.051 | 10.856 |
| 94.00334696913353 | 2.849 | 10.354 | 1.043 | 10.887 |
| 94.17069542580886 | 2.897 | 10.354 | 1.027 | 10.887 |
| 94.3380438824842 | 2.929 | 10.338 | 1.019 | 10.887 |
| 94.50539233915954 | 2.961 | 10.322 | 1.003 | 10.88 |
| 94.66344365935292 | 2.977 | 10.307 | 0.995 | 10.864 |
| 94.83079211602828 | 2.985 | 10.291 | 0.971 | 10.848 |
| 94.99814057270362 | 2.992 | 10.259 | 0.955 | 10.824 |
| 95.16548902937897 | 3 | 10.211 | 0.923 | 10.784 |
| 95.33283748605432 | 3.008 | 10.147 | 0.899 | 10.72 |
| 95.50018594272963 | 3.008 | 10.068 | 0.867 | 10.649 |
| 95.66753439940499 | 3 | 9.972 | 0.836 | 10.561 |
| 95.83488285608034 | 3 | 9.861 | 0.788 | 10.458 |
| 96.00223131275567 | 3 | 9.741 | 0.74 | 10.338 |
| 96.16957976943102 | 3 | 9.598 | 0.692 | 10.203 |
| 96.33692822610638 | 3.008 | 9.439 | 0.629 | 10.06 |
| 96.50427668278171 | 3.016 | 9.264 | 0.565 | 9.893 |
| 96.67162513945706 | 3.024 | 9.073 | 0.501 | 9.718 |
| 96.8389735961324 | 3.04 | 8.866 | 0.438 | 9.535 |
| 96.99702491632577 | 3.048 | 8.659 | 0.374 | 9.344 |
| 97.16437337300111 | 3.056 | 8.444 | 0.302 | 9.145 |
| 97.33172182967647 | 3.048 | 8.221 | 0.247 | 8.946 |
| 97.49907028635181 | 3.032 | 8.006 | 0.183 | 8.739 |
| 97.66641874302715 | 2.985 | 7.784 | 0.127 | 8.524 |
| 97.8337671997025 | 2.937 | 7.569 | 0.08 | 8.309 |
| 98.00111565637785 | 2.881 | 7.362 | 0.024 | 8.11 |
| 98.16846411305319 | 2.833 | 7.171 | -0.024 | 7.919 |
| 98.33581256972855 | 2.794 | 6.996 | -0.064 | 7.752 |
| 98.50316102640389 | 2.746 | 6.837 | -0.111 | 7.593 |
| 98.67050948307921 | 2.698 | 6.669 | -0.151 | 7.425 |
| 98.83785793975456 | 2.65 | 6.518 | -0.191 | 7.274 |
| 99.0052063964299 | 2.602 | 6.375 | -0.223 | 7.131 |
| 99.17255485310525 | 2.555 | 6.232 | -0.247 | 6.996 |
| 99.33060617329863 | 2.515 | 6.104 | -0.263 | 6.868 |
| 99.49795462997399 | 2.475 | 5.993 | -0.287 | 6.757 |
| 99.66530308664933 | 2.459 | 5.897 | -0.302 | 6.669 |
| 99.83265154332467 | 2.443 | 5.818 | -0.326 | 6.606 |
| 100.0 | 2.435 | 5.778 | -0.334 | 6.566 |